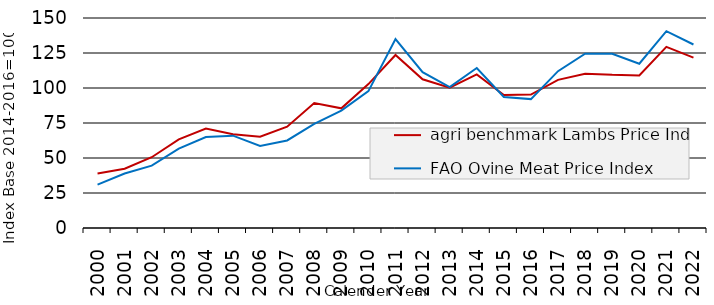
| Category |  agri benchmark Lambs Price Index  |  FAO Ovine Meat Price Index |
|---|---|---|
| 2000.0 | 38.942 | 30.939 |
| 2001.0 | 42.297 | 38.911 |
| 2002.0 | 50.55 | 44.531 |
| 2003.0 | 63.299 | 56.701 |
| 2004.0 | 71.019 | 64.938 |
| 2005.0 | 66.909 | 65.95 |
| 2006.0 | 65.24 | 58.554 |
| 2007.0 | 72.335 | 62.525 |
| 2008.0 | 89.214 | 74.374 |
| 2009.0 | 85.478 | 83.899 |
| 2010.0 | 102.814 | 97.78 |
| 2011.0 | 123.593 | 134.9 |
| 2012.0 | 106.231 | 111.309 |
| 2013.0 | 100.213 | 100.607 |
| 2014.0 | 109.708 | 114.317 |
| 2015.0 | 94.984 | 93.625 |
| 2016.0 | 95.309 | 92.058 |
| 2017.0 | 105.831 | 112.025 |
| 2018.0 | 110.202 | 124.475 |
| 2019.0 | 109.376 | 124.494 |
| 2020.0 | 108.998 | 117.341 |
| 2021.0 | 129.404 | 140.563 |
| 2022.0 | 121.666 | 131.07 |